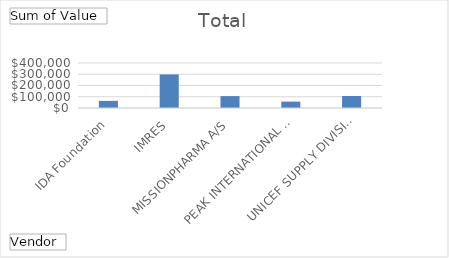
| Category | Total |
|---|---|
| IDA Foundation | 63406.14 |
| IMRES | 298525 |
| MISSIONPHARMA A/S | 105600 |
| PEAK INTERNATIONAL TRADE (TIANJIN)CO LTD | 56697.2 |
| UNICEF SUPPLY DIVISION | 106722 |